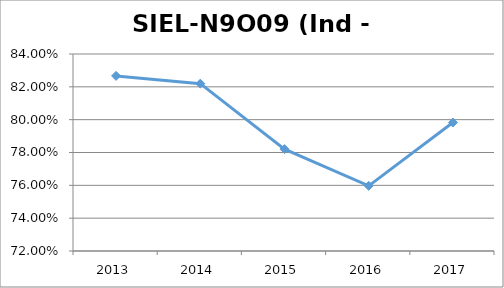
| Category | SIEL-N9O09 |
|---|---|
| 2013.0 | 0.827 |
| 2014.0 | 0.822 |
| 2015.0 | 0.782 |
| 2016.0 | 0.76 |
| 2017.0 | 0.798 |